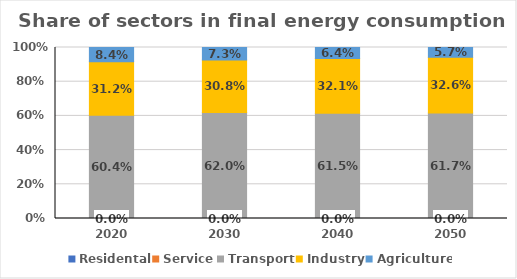
| Category | Residental | Service | Transport | Industry | Agriculture |
|---|---|---|---|---|---|
| 2020.0 | 0 | 0 | 0.604 | 0.312 | 0.084 |
| 2030.0 | 0 | 0 | 0.62 | 0.308 | 0.073 |
| 2040.0 | 0 | 0 | 0.615 | 0.321 | 0.064 |
| 2050.0 | 0 | 0 | 0.617 | 0.326 | 0.057 |